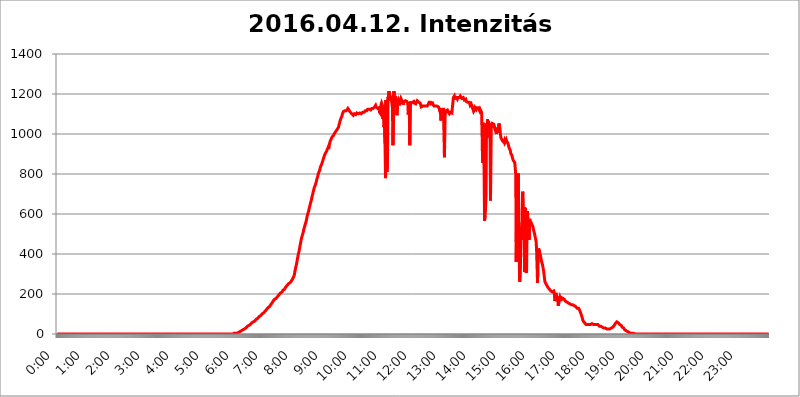
| Category | 2016.04.12. Intenzitás [W/m^2] |
|---|---|
| 0.0 | 0 |
| 0.0006944444444444445 | 0 |
| 0.001388888888888889 | 0 |
| 0.0020833333333333333 | 0 |
| 0.002777777777777778 | 0 |
| 0.003472222222222222 | 0 |
| 0.004166666666666667 | 0 |
| 0.004861111111111111 | 0 |
| 0.005555555555555556 | 0 |
| 0.0062499999999999995 | 0 |
| 0.006944444444444444 | 0 |
| 0.007638888888888889 | 0 |
| 0.008333333333333333 | 0 |
| 0.009027777777777779 | 0 |
| 0.009722222222222222 | 0 |
| 0.010416666666666666 | 0 |
| 0.011111111111111112 | 0 |
| 0.011805555555555555 | 0 |
| 0.012499999999999999 | 0 |
| 0.013194444444444444 | 0 |
| 0.013888888888888888 | 0 |
| 0.014583333333333332 | 0 |
| 0.015277777777777777 | 0 |
| 0.015972222222222224 | 0 |
| 0.016666666666666666 | 0 |
| 0.017361111111111112 | 0 |
| 0.018055555555555557 | 0 |
| 0.01875 | 0 |
| 0.019444444444444445 | 0 |
| 0.02013888888888889 | 0 |
| 0.020833333333333332 | 0 |
| 0.02152777777777778 | 0 |
| 0.022222222222222223 | 0 |
| 0.02291666666666667 | 0 |
| 0.02361111111111111 | 0 |
| 0.024305555555555556 | 0 |
| 0.024999999999999998 | 0 |
| 0.025694444444444447 | 0 |
| 0.02638888888888889 | 0 |
| 0.027083333333333334 | 0 |
| 0.027777777777777776 | 0 |
| 0.02847222222222222 | 0 |
| 0.029166666666666664 | 0 |
| 0.029861111111111113 | 0 |
| 0.030555555555555555 | 0 |
| 0.03125 | 0 |
| 0.03194444444444445 | 0 |
| 0.03263888888888889 | 0 |
| 0.03333333333333333 | 0 |
| 0.034027777777777775 | 0 |
| 0.034722222222222224 | 0 |
| 0.035416666666666666 | 0 |
| 0.036111111111111115 | 0 |
| 0.03680555555555556 | 0 |
| 0.0375 | 0 |
| 0.03819444444444444 | 0 |
| 0.03888888888888889 | 0 |
| 0.03958333333333333 | 0 |
| 0.04027777777777778 | 0 |
| 0.04097222222222222 | 0 |
| 0.041666666666666664 | 0 |
| 0.042361111111111106 | 0 |
| 0.04305555555555556 | 0 |
| 0.043750000000000004 | 0 |
| 0.044444444444444446 | 0 |
| 0.04513888888888889 | 0 |
| 0.04583333333333334 | 0 |
| 0.04652777777777778 | 0 |
| 0.04722222222222222 | 0 |
| 0.04791666666666666 | 0 |
| 0.04861111111111111 | 0 |
| 0.049305555555555554 | 0 |
| 0.049999999999999996 | 0 |
| 0.05069444444444445 | 0 |
| 0.051388888888888894 | 0 |
| 0.052083333333333336 | 0 |
| 0.05277777777777778 | 0 |
| 0.05347222222222222 | 0 |
| 0.05416666666666667 | 0 |
| 0.05486111111111111 | 0 |
| 0.05555555555555555 | 0 |
| 0.05625 | 0 |
| 0.05694444444444444 | 0 |
| 0.057638888888888885 | 0 |
| 0.05833333333333333 | 0 |
| 0.05902777777777778 | 0 |
| 0.059722222222222225 | 0 |
| 0.06041666666666667 | 0 |
| 0.061111111111111116 | 0 |
| 0.06180555555555556 | 0 |
| 0.0625 | 0 |
| 0.06319444444444444 | 0 |
| 0.06388888888888888 | 0 |
| 0.06458333333333334 | 0 |
| 0.06527777777777778 | 0 |
| 0.06597222222222222 | 0 |
| 0.06666666666666667 | 0 |
| 0.06736111111111111 | 0 |
| 0.06805555555555555 | 0 |
| 0.06874999999999999 | 0 |
| 0.06944444444444443 | 0 |
| 0.07013888888888889 | 0 |
| 0.07083333333333333 | 0 |
| 0.07152777777777779 | 0 |
| 0.07222222222222223 | 0 |
| 0.07291666666666667 | 0 |
| 0.07361111111111111 | 0 |
| 0.07430555555555556 | 0 |
| 0.075 | 0 |
| 0.07569444444444444 | 0 |
| 0.0763888888888889 | 0 |
| 0.07708333333333334 | 0 |
| 0.07777777777777778 | 0 |
| 0.07847222222222222 | 0 |
| 0.07916666666666666 | 0 |
| 0.0798611111111111 | 0 |
| 0.08055555555555556 | 0 |
| 0.08125 | 0 |
| 0.08194444444444444 | 0 |
| 0.08263888888888889 | 0 |
| 0.08333333333333333 | 0 |
| 0.08402777777777777 | 0 |
| 0.08472222222222221 | 0 |
| 0.08541666666666665 | 0 |
| 0.08611111111111112 | 0 |
| 0.08680555555555557 | 0 |
| 0.08750000000000001 | 0 |
| 0.08819444444444445 | 0 |
| 0.08888888888888889 | 0 |
| 0.08958333333333333 | 0 |
| 0.09027777777777778 | 0 |
| 0.09097222222222222 | 0 |
| 0.09166666666666667 | 0 |
| 0.09236111111111112 | 0 |
| 0.09305555555555556 | 0 |
| 0.09375 | 0 |
| 0.09444444444444444 | 0 |
| 0.09513888888888888 | 0 |
| 0.09583333333333333 | 0 |
| 0.09652777777777777 | 0 |
| 0.09722222222222222 | 0 |
| 0.09791666666666667 | 0 |
| 0.09861111111111111 | 0 |
| 0.09930555555555555 | 0 |
| 0.09999999999999999 | 0 |
| 0.10069444444444443 | 0 |
| 0.1013888888888889 | 0 |
| 0.10208333333333335 | 0 |
| 0.10277777777777779 | 0 |
| 0.10347222222222223 | 0 |
| 0.10416666666666667 | 0 |
| 0.10486111111111111 | 0 |
| 0.10555555555555556 | 0 |
| 0.10625 | 0 |
| 0.10694444444444444 | 0 |
| 0.1076388888888889 | 0 |
| 0.10833333333333334 | 0 |
| 0.10902777777777778 | 0 |
| 0.10972222222222222 | 0 |
| 0.1111111111111111 | 0 |
| 0.11180555555555556 | 0 |
| 0.11180555555555556 | 0 |
| 0.1125 | 0 |
| 0.11319444444444444 | 0 |
| 0.11388888888888889 | 0 |
| 0.11458333333333333 | 0 |
| 0.11527777777777777 | 0 |
| 0.11597222222222221 | 0 |
| 0.11666666666666665 | 0 |
| 0.1173611111111111 | 0 |
| 0.11805555555555557 | 0 |
| 0.11944444444444445 | 0 |
| 0.12013888888888889 | 0 |
| 0.12083333333333333 | 0 |
| 0.12152777777777778 | 0 |
| 0.12222222222222223 | 0 |
| 0.12291666666666667 | 0 |
| 0.12291666666666667 | 0 |
| 0.12361111111111112 | 0 |
| 0.12430555555555556 | 0 |
| 0.125 | 0 |
| 0.12569444444444444 | 0 |
| 0.12638888888888888 | 0 |
| 0.12708333333333333 | 0 |
| 0.16875 | 0 |
| 0.12847222222222224 | 0 |
| 0.12916666666666668 | 0 |
| 0.12986111111111112 | 0 |
| 0.13055555555555556 | 0 |
| 0.13125 | 0 |
| 0.13194444444444445 | 0 |
| 0.1326388888888889 | 0 |
| 0.13333333333333333 | 0 |
| 0.13402777777777777 | 0 |
| 0.13402777777777777 | 0 |
| 0.13472222222222222 | 0 |
| 0.13541666666666666 | 0 |
| 0.1361111111111111 | 0 |
| 0.13749999999999998 | 0 |
| 0.13819444444444443 | 0 |
| 0.1388888888888889 | 0 |
| 0.13958333333333334 | 0 |
| 0.14027777777777778 | 0 |
| 0.14097222222222222 | 0 |
| 0.14166666666666666 | 0 |
| 0.1423611111111111 | 0 |
| 0.14305555555555557 | 0 |
| 0.14375000000000002 | 0 |
| 0.14444444444444446 | 0 |
| 0.1451388888888889 | 0 |
| 0.1451388888888889 | 0 |
| 0.14652777777777778 | 0 |
| 0.14722222222222223 | 0 |
| 0.14791666666666667 | 0 |
| 0.1486111111111111 | 0 |
| 0.14930555555555555 | 0 |
| 0.15 | 0 |
| 0.15069444444444444 | 0 |
| 0.15138888888888888 | 0 |
| 0.15208333333333332 | 0 |
| 0.15277777777777776 | 0 |
| 0.15347222222222223 | 0 |
| 0.15416666666666667 | 0 |
| 0.15486111111111112 | 0 |
| 0.15555555555555556 | 0 |
| 0.15625 | 0 |
| 0.15694444444444444 | 0 |
| 0.15763888888888888 | 0 |
| 0.15833333333333333 | 0 |
| 0.15902777777777777 | 0 |
| 0.15972222222222224 | 0 |
| 0.16041666666666668 | 0 |
| 0.16111111111111112 | 0 |
| 0.16180555555555556 | 0 |
| 0.1625 | 0 |
| 0.16319444444444445 | 0 |
| 0.1638888888888889 | 0 |
| 0.16458333333333333 | 0 |
| 0.16527777777777777 | 0 |
| 0.16597222222222222 | 0 |
| 0.16666666666666666 | 0 |
| 0.1673611111111111 | 0 |
| 0.16805555555555554 | 0 |
| 0.16874999999999998 | 0 |
| 0.16944444444444443 | 0 |
| 0.17013888888888887 | 0 |
| 0.1708333333333333 | 0 |
| 0.17152777777777775 | 0 |
| 0.17222222222222225 | 0 |
| 0.1729166666666667 | 0 |
| 0.17361111111111113 | 0 |
| 0.17430555555555557 | 0 |
| 0.17500000000000002 | 0 |
| 0.17569444444444446 | 0 |
| 0.1763888888888889 | 0 |
| 0.17708333333333334 | 0 |
| 0.17777777777777778 | 0 |
| 0.17847222222222223 | 0 |
| 0.17916666666666667 | 0 |
| 0.1798611111111111 | 0 |
| 0.18055555555555555 | 0 |
| 0.18125 | 0 |
| 0.18194444444444444 | 0 |
| 0.1826388888888889 | 0 |
| 0.18333333333333335 | 0 |
| 0.1840277777777778 | 0 |
| 0.18472222222222223 | 0 |
| 0.18541666666666667 | 0 |
| 0.18611111111111112 | 0 |
| 0.18680555555555556 | 0 |
| 0.1875 | 0 |
| 0.18819444444444444 | 0 |
| 0.18888888888888888 | 0 |
| 0.18958333333333333 | 0 |
| 0.19027777777777777 | 0 |
| 0.1909722222222222 | 0 |
| 0.19166666666666665 | 0 |
| 0.19236111111111112 | 0 |
| 0.19305555555555554 | 0 |
| 0.19375 | 0 |
| 0.19444444444444445 | 0 |
| 0.1951388888888889 | 0 |
| 0.19583333333333333 | 0 |
| 0.19652777777777777 | 0 |
| 0.19722222222222222 | 0 |
| 0.19791666666666666 | 0 |
| 0.1986111111111111 | 0 |
| 0.19930555555555554 | 0 |
| 0.19999999999999998 | 0 |
| 0.20069444444444443 | 0 |
| 0.20138888888888887 | 0 |
| 0.2020833333333333 | 0 |
| 0.2027777777777778 | 0 |
| 0.2034722222222222 | 0 |
| 0.2041666666666667 | 0 |
| 0.20486111111111113 | 0 |
| 0.20555555555555557 | 0 |
| 0.20625000000000002 | 0 |
| 0.20694444444444446 | 0 |
| 0.2076388888888889 | 0 |
| 0.20833333333333334 | 0 |
| 0.20902777777777778 | 0 |
| 0.20972222222222223 | 0 |
| 0.21041666666666667 | 0 |
| 0.2111111111111111 | 0 |
| 0.21180555555555555 | 0 |
| 0.2125 | 0 |
| 0.21319444444444444 | 0 |
| 0.2138888888888889 | 0 |
| 0.21458333333333335 | 0 |
| 0.2152777777777778 | 0 |
| 0.21597222222222223 | 0 |
| 0.21666666666666667 | 0 |
| 0.21736111111111112 | 0 |
| 0.21805555555555556 | 0 |
| 0.21875 | 0 |
| 0.21944444444444444 | 0 |
| 0.22013888888888888 | 0 |
| 0.22083333333333333 | 0 |
| 0.22152777777777777 | 0 |
| 0.2222222222222222 | 0 |
| 0.22291666666666665 | 0 |
| 0.2236111111111111 | 0 |
| 0.22430555555555556 | 0 |
| 0.225 | 0 |
| 0.22569444444444445 | 0 |
| 0.2263888888888889 | 0 |
| 0.22708333333333333 | 0 |
| 0.22777777777777777 | 0 |
| 0.22847222222222222 | 0 |
| 0.22916666666666666 | 0 |
| 0.2298611111111111 | 0 |
| 0.23055555555555554 | 0 |
| 0.23124999999999998 | 0 |
| 0.23194444444444443 | 0 |
| 0.23263888888888887 | 0 |
| 0.2333333333333333 | 0 |
| 0.2340277777777778 | 0 |
| 0.2347222222222222 | 0 |
| 0.2354166666666667 | 0 |
| 0.23611111111111113 | 0 |
| 0.23680555555555557 | 0 |
| 0.23750000000000002 | 0 |
| 0.23819444444444446 | 0 |
| 0.2388888888888889 | 0 |
| 0.23958333333333334 | 0 |
| 0.24027777777777778 | 0 |
| 0.24097222222222223 | 0 |
| 0.24166666666666667 | 0 |
| 0.2423611111111111 | 0 |
| 0.24305555555555555 | 0 |
| 0.24375 | 0 |
| 0.24444444444444446 | 0 |
| 0.24513888888888888 | 0 |
| 0.24583333333333335 | 0 |
| 0.2465277777777778 | 0 |
| 0.24722222222222223 | 3.525 |
| 0.24791666666666667 | 3.525 |
| 0.24861111111111112 | 3.525 |
| 0.24930555555555556 | 3.525 |
| 0.25 | 3.525 |
| 0.25069444444444444 | 3.525 |
| 0.2513888888888889 | 3.525 |
| 0.2520833333333333 | 3.525 |
| 0.25277777777777777 | 7.887 |
| 0.2534722222222222 | 7.887 |
| 0.25416666666666665 | 7.887 |
| 0.2548611111111111 | 7.887 |
| 0.2555555555555556 | 12.257 |
| 0.25625000000000003 | 12.257 |
| 0.2569444444444445 | 12.257 |
| 0.2576388888888889 | 16.636 |
| 0.25833333333333336 | 16.636 |
| 0.2590277777777778 | 16.636 |
| 0.25972222222222224 | 21.024 |
| 0.2604166666666667 | 21.024 |
| 0.2611111111111111 | 21.024 |
| 0.26180555555555557 | 25.419 |
| 0.2625 | 25.419 |
| 0.26319444444444445 | 29.823 |
| 0.2638888888888889 | 29.823 |
| 0.26458333333333334 | 29.823 |
| 0.2652777777777778 | 34.234 |
| 0.2659722222222222 | 34.234 |
| 0.26666666666666666 | 38.653 |
| 0.2673611111111111 | 38.653 |
| 0.26805555555555555 | 43.079 |
| 0.26875 | 43.079 |
| 0.26944444444444443 | 43.079 |
| 0.2701388888888889 | 47.511 |
| 0.2708333333333333 | 47.511 |
| 0.27152777777777776 | 51.951 |
| 0.2722222222222222 | 51.951 |
| 0.27291666666666664 | 56.398 |
| 0.2736111111111111 | 56.398 |
| 0.2743055555555555 | 60.85 |
| 0.27499999999999997 | 60.85 |
| 0.27569444444444446 | 65.31 |
| 0.27638888888888885 | 65.31 |
| 0.27708333333333335 | 65.31 |
| 0.2777777777777778 | 69.775 |
| 0.27847222222222223 | 69.775 |
| 0.2791666666666667 | 74.246 |
| 0.2798611111111111 | 74.246 |
| 0.28055555555555556 | 78.722 |
| 0.28125 | 78.722 |
| 0.28194444444444444 | 83.205 |
| 0.2826388888888889 | 83.205 |
| 0.2833333333333333 | 87.692 |
| 0.28402777777777777 | 87.692 |
| 0.2847222222222222 | 87.692 |
| 0.28541666666666665 | 92.184 |
| 0.28611111111111115 | 92.184 |
| 0.28680555555555554 | 96.682 |
| 0.28750000000000003 | 101.184 |
| 0.2881944444444445 | 101.184 |
| 0.2888888888888889 | 105.69 |
| 0.28958333333333336 | 105.69 |
| 0.2902777777777778 | 110.201 |
| 0.29097222222222224 | 110.201 |
| 0.2916666666666667 | 114.716 |
| 0.2923611111111111 | 119.235 |
| 0.29305555555555557 | 119.235 |
| 0.29375 | 123.758 |
| 0.29444444444444445 | 123.758 |
| 0.2951388888888889 | 128.284 |
| 0.29583333333333334 | 132.814 |
| 0.2965277777777778 | 132.814 |
| 0.2972222222222222 | 137.347 |
| 0.29791666666666666 | 137.347 |
| 0.2986111111111111 | 141.884 |
| 0.29930555555555555 | 146.423 |
| 0.3 | 146.423 |
| 0.30069444444444443 | 150.964 |
| 0.3013888888888889 | 155.509 |
| 0.3020833333333333 | 160.056 |
| 0.30277777777777776 | 164.605 |
| 0.3034722222222222 | 164.605 |
| 0.30416666666666664 | 169.156 |
| 0.3048611111111111 | 173.709 |
| 0.3055555555555555 | 173.709 |
| 0.30624999999999997 | 178.264 |
| 0.3069444444444444 | 178.264 |
| 0.3076388888888889 | 182.82 |
| 0.30833333333333335 | 182.82 |
| 0.3090277777777778 | 187.378 |
| 0.30972222222222223 | 191.937 |
| 0.3104166666666667 | 191.937 |
| 0.3111111111111111 | 196.497 |
| 0.31180555555555556 | 196.497 |
| 0.3125 | 201.058 |
| 0.31319444444444444 | 205.62 |
| 0.3138888888888889 | 210.182 |
| 0.3145833333333333 | 210.182 |
| 0.31527777777777777 | 210.182 |
| 0.3159722222222222 | 214.746 |
| 0.31666666666666665 | 219.309 |
| 0.31736111111111115 | 219.309 |
| 0.31805555555555554 | 223.873 |
| 0.31875000000000003 | 223.873 |
| 0.3194444444444445 | 228.436 |
| 0.3201388888888889 | 233 |
| 0.32083333333333336 | 233 |
| 0.3215277777777778 | 237.564 |
| 0.32222222222222224 | 242.127 |
| 0.3229166666666667 | 242.127 |
| 0.3236111111111111 | 246.689 |
| 0.32430555555555557 | 251.251 |
| 0.325 | 251.251 |
| 0.32569444444444445 | 255.813 |
| 0.3263888888888889 | 255.813 |
| 0.32708333333333334 | 260.373 |
| 0.3277777777777778 | 260.373 |
| 0.3284722222222222 | 264.932 |
| 0.32916666666666666 | 269.49 |
| 0.3298611111111111 | 274.047 |
| 0.33055555555555555 | 278.603 |
| 0.33125 | 283.156 |
| 0.33194444444444443 | 287.709 |
| 0.3326388888888889 | 296.808 |
| 0.3333333333333333 | 314.98 |
| 0.3340277777777778 | 324.052 |
| 0.3347222222222222 | 337.639 |
| 0.3354166666666667 | 346.682 |
| 0.3361111111111111 | 360.221 |
| 0.3368055555555556 | 373.729 |
| 0.33749999999999997 | 387.202 |
| 0.33819444444444446 | 400.638 |
| 0.33888888888888885 | 409.574 |
| 0.33958333333333335 | 422.943 |
| 0.34027777777777773 | 436.27 |
| 0.34097222222222223 | 449.551 |
| 0.3416666666666666 | 462.786 |
| 0.3423611111111111 | 475.972 |
| 0.3430555555555555 | 484.735 |
| 0.34375 | 493.475 |
| 0.3444444444444445 | 502.192 |
| 0.3451388888888889 | 510.885 |
| 0.3458333333333334 | 523.88 |
| 0.34652777777777777 | 528.2 |
| 0.34722222222222227 | 541.121 |
| 0.34791666666666665 | 545.416 |
| 0.34861111111111115 | 558.261 |
| 0.34930555555555554 | 566.793 |
| 0.35000000000000003 | 579.542 |
| 0.3506944444444444 | 592.233 |
| 0.3513888888888889 | 600.661 |
| 0.3520833333333333 | 609.062 |
| 0.3527777777777778 | 617.436 |
| 0.3534722222222222 | 629.948 |
| 0.3541666666666667 | 638.256 |
| 0.3548611111111111 | 650.667 |
| 0.35555555555555557 | 658.909 |
| 0.35625 | 667.123 |
| 0.35694444444444445 | 679.395 |
| 0.3576388888888889 | 691.608 |
| 0.35833333333333334 | 699.717 |
| 0.3590277777777778 | 711.832 |
| 0.3597222222222222 | 719.877 |
| 0.36041666666666666 | 731.896 |
| 0.3611111111111111 | 735.89 |
| 0.36180555555555555 | 743.859 |
| 0.3625 | 751.803 |
| 0.36319444444444443 | 759.723 |
| 0.3638888888888889 | 771.559 |
| 0.3645833333333333 | 779.42 |
| 0.3652777777777778 | 787.258 |
| 0.3659722222222222 | 798.974 |
| 0.3666666666666667 | 806.757 |
| 0.3673611111111111 | 810.641 |
| 0.3680555555555556 | 818.392 |
| 0.36874999999999997 | 829.981 |
| 0.36944444444444446 | 837.682 |
| 0.37013888888888885 | 841.526 |
| 0.37083333333333335 | 849.199 |
| 0.37152777777777773 | 856.855 |
| 0.37222222222222223 | 864.493 |
| 0.3729166666666666 | 872.114 |
| 0.3736111111111111 | 879.719 |
| 0.3743055555555555 | 887.309 |
| 0.375 | 894.885 |
| 0.3756944444444445 | 898.668 |
| 0.3763888888888889 | 906.223 |
| 0.3770833333333334 | 909.996 |
| 0.37777777777777777 | 913.766 |
| 0.37847222222222227 | 921.298 |
| 0.37916666666666665 | 921.298 |
| 0.37986111111111115 | 932.576 |
| 0.38055555555555554 | 925.06 |
| 0.38125000000000003 | 940.082 |
| 0.3819444444444444 | 951.327 |
| 0.3826388888888889 | 962.555 |
| 0.3833333333333333 | 966.295 |
| 0.3840277777777778 | 973.772 |
| 0.3847222222222222 | 977.508 |
| 0.3854166666666667 | 984.98 |
| 0.3861111111111111 | 981.244 |
| 0.38680555555555557 | 988.714 |
| 0.3875 | 992.448 |
| 0.38819444444444445 | 996.182 |
| 0.3888888888888889 | 1003.65 |
| 0.38958333333333334 | 1007.383 |
| 0.3902777777777778 | 1011.118 |
| 0.3909722222222222 | 1014.852 |
| 0.39166666666666666 | 1014.852 |
| 0.3923611111111111 | 1022.323 |
| 0.39305555555555555 | 1022.323 |
| 0.39375 | 1026.06 |
| 0.39444444444444443 | 1033.537 |
| 0.3951388888888889 | 1044.762 |
| 0.3958333333333333 | 1052.255 |
| 0.3965277777777778 | 1063.51 |
| 0.3972222222222222 | 1067.267 |
| 0.3979166666666667 | 1078.555 |
| 0.3986111111111111 | 1078.555 |
| 0.3993055555555556 | 1089.873 |
| 0.39999999999999997 | 1101.226 |
| 0.40069444444444446 | 1105.019 |
| 0.40138888888888885 | 1112.618 |
| 0.40208333333333335 | 1116.426 |
| 0.40277777777777773 | 1116.426 |
| 0.40347222222222223 | 1116.426 |
| 0.4041666666666666 | 1116.426 |
| 0.4048611111111111 | 1116.426 |
| 0.4055555555555555 | 1116.426 |
| 0.40625 | 1120.238 |
| 0.4069444444444445 | 1120.238 |
| 0.4076388888888889 | 1127.879 |
| 0.4083333333333334 | 1127.879 |
| 0.40902777777777777 | 1124.056 |
| 0.40972222222222227 | 1116.426 |
| 0.41041666666666665 | 1112.618 |
| 0.41111111111111115 | 1108.816 |
| 0.41180555555555554 | 1108.816 |
| 0.41250000000000003 | 1108.816 |
| 0.4131944444444444 | 1101.226 |
| 0.4138888888888889 | 1097.437 |
| 0.4145833333333333 | 1101.226 |
| 0.4152777777777778 | 1093.653 |
| 0.4159722222222222 | 1097.437 |
| 0.4166666666666667 | 1101.226 |
| 0.4173611111111111 | 1101.226 |
| 0.41805555555555557 | 1097.437 |
| 0.41875 | 1097.437 |
| 0.41944444444444445 | 1101.226 |
| 0.4201388888888889 | 1105.019 |
| 0.42083333333333334 | 1101.226 |
| 0.4215277777777778 | 1105.019 |
| 0.4222222222222222 | 1101.226 |
| 0.42291666666666666 | 1101.226 |
| 0.4236111111111111 | 1101.226 |
| 0.42430555555555555 | 1105.019 |
| 0.425 | 1101.226 |
| 0.42569444444444443 | 1101.226 |
| 0.4263888888888889 | 1101.226 |
| 0.4270833333333333 | 1105.019 |
| 0.4277777777777778 | 1101.226 |
| 0.4284722222222222 | 1108.816 |
| 0.4291666666666667 | 1108.816 |
| 0.4298611111111111 | 1108.816 |
| 0.4305555555555556 | 1108.816 |
| 0.43124999999999997 | 1112.618 |
| 0.43194444444444446 | 1116.426 |
| 0.43263888888888885 | 1112.618 |
| 0.43333333333333335 | 1116.426 |
| 0.43402777777777773 | 1116.426 |
| 0.43472222222222223 | 1120.238 |
| 0.4354166666666666 | 1124.056 |
| 0.4361111111111111 | 1120.238 |
| 0.4368055555555555 | 1120.238 |
| 0.4375 | 1124.056 |
| 0.4381944444444445 | 1124.056 |
| 0.4388888888888889 | 1120.238 |
| 0.4395833333333334 | 1120.238 |
| 0.44027777777777777 | 1124.056 |
| 0.44097222222222227 | 1127.879 |
| 0.44166666666666665 | 1127.879 |
| 0.44236111111111115 | 1124.056 |
| 0.44305555555555554 | 1127.879 |
| 0.44375000000000003 | 1127.879 |
| 0.4444444444444444 | 1124.056 |
| 0.4451388888888889 | 1135.543 |
| 0.4458333333333333 | 1139.384 |
| 0.4465277777777778 | 1143.232 |
| 0.4472222222222222 | 1135.543 |
| 0.4479166666666667 | 1135.543 |
| 0.4486111111111111 | 1135.543 |
| 0.44930555555555557 | 1127.879 |
| 0.45 | 1124.056 |
| 0.45069444444444445 | 1124.056 |
| 0.4513888888888889 | 1131.708 |
| 0.45208333333333334 | 1108.816 |
| 0.4527777777777778 | 1105.019 |
| 0.4534722222222222 | 1101.226 |
| 0.45416666666666666 | 1147.086 |
| 0.4548611111111111 | 1154.814 |
| 0.45555555555555555 | 1150.946 |
| 0.45625 | 1139.384 |
| 0.45694444444444443 | 1074.789 |
| 0.4576388888888889 | 1143.232 |
| 0.4583333333333333 | 1033.537 |
| 0.4590277777777778 | 1048.508 |
| 0.4597222222222222 | 951.327 |
| 0.4604166666666667 | 779.42 |
| 0.4611111111111111 | 1170.358 |
| 0.4618055555555556 | 921.298 |
| 0.46249999999999997 | 810.641 |
| 0.46319444444444446 | 872.114 |
| 0.46388888888888885 | 1186.03 |
| 0.46458333333333335 | 1166.46 |
| 0.46527777777777773 | 1213.804 |
| 0.46597222222222223 | 1189.969 |
| 0.4666666666666666 | 1186.03 |
| 0.4673611111111111 | 1193.918 |
| 0.4680555555555555 | 1186.03 |
| 0.46875 | 1189.969 |
| 0.4694444444444445 | 1150.946 |
| 0.4701388888888889 | 1131.708 |
| 0.4708333333333334 | 943.832 |
| 0.47152777777777777 | 947.58 |
| 0.47222222222222227 | 1213.804 |
| 0.47291666666666665 | 1150.946 |
| 0.47361111111111115 | 1162.571 |
| 0.47430555555555554 | 1189.969 |
| 0.47500000000000003 | 1174.263 |
| 0.4756944444444444 | 1158.689 |
| 0.4763888888888889 | 1093.653 |
| 0.4770833333333333 | 1147.086 |
| 0.4777777777777778 | 1162.571 |
| 0.4784722222222222 | 1170.358 |
| 0.4791666666666667 | 1162.571 |
| 0.4798611111111111 | 1143.232 |
| 0.48055555555555557 | 1154.814 |
| 0.48125 | 1170.358 |
| 0.48194444444444445 | 1178.177 |
| 0.4826388888888889 | 1174.263 |
| 0.48333333333333334 | 1166.46 |
| 0.4840277777777778 | 1150.946 |
| 0.4847222222222222 | 1162.571 |
| 0.48541666666666666 | 1147.086 |
| 0.4861111111111111 | 1162.571 |
| 0.48680555555555555 | 1158.689 |
| 0.4875 | 1162.571 |
| 0.48819444444444443 | 1166.46 |
| 0.4888888888888889 | 1166.46 |
| 0.4895833333333333 | 1170.358 |
| 0.4902777777777778 | 1162.571 |
| 0.4909722222222222 | 1162.571 |
| 0.4916666666666667 | 1150.946 |
| 0.4923611111111111 | 1097.437 |
| 0.4930555555555556 | 1158.689 |
| 0.49374999999999997 | 1135.543 |
| 0.49444444444444446 | 943.832 |
| 0.49513888888888885 | 1162.571 |
| 0.49583333333333335 | 1150.946 |
| 0.49652777777777773 | 1150.946 |
| 0.49722222222222223 | 1150.946 |
| 0.4979166666666666 | 1158.689 |
| 0.4986111111111111 | 1154.814 |
| 0.4993055555555555 | 1158.689 |
| 0.5 | 1162.571 |
| 0.5006944444444444 | 1154.814 |
| 0.5013888888888889 | 1150.946 |
| 0.5020833333333333 | 1154.814 |
| 0.5027777777777778 | 1150.946 |
| 0.5034722222222222 | 1150.946 |
| 0.5041666666666667 | 1147.086 |
| 0.5048611111111111 | 1166.46 |
| 0.5055555555555555 | 1162.571 |
| 0.50625 | 1162.571 |
| 0.5069444444444444 | 1158.689 |
| 0.5076388888888889 | 1154.814 |
| 0.5083333333333333 | 1154.814 |
| 0.5090277777777777 | 1154.814 |
| 0.5097222222222222 | 1147.086 |
| 0.5104166666666666 | 1135.543 |
| 0.5111111111111112 | 1131.708 |
| 0.5118055555555555 | 1135.543 |
| 0.5125000000000001 | 1139.384 |
| 0.5131944444444444 | 1143.232 |
| 0.513888888888889 | 1135.543 |
| 0.5145833333333333 | 1139.384 |
| 0.5152777777777778 | 1139.384 |
| 0.5159722222222222 | 1143.232 |
| 0.5166666666666667 | 1139.384 |
| 0.517361111111111 | 1139.384 |
| 0.5180555555555556 | 1139.384 |
| 0.5187499999999999 | 1139.384 |
| 0.5194444444444445 | 1143.232 |
| 0.5201388888888888 | 1147.086 |
| 0.5208333333333334 | 1147.086 |
| 0.5215277777777778 | 1158.689 |
| 0.5222222222222223 | 1158.689 |
| 0.5229166666666667 | 1162.571 |
| 0.5236111111111111 | 1158.689 |
| 0.5243055555555556 | 1150.946 |
| 0.525 | 1154.814 |
| 0.5256944444444445 | 1154.814 |
| 0.5263888888888889 | 1154.814 |
| 0.5270833333333333 | 1147.086 |
| 0.5277777777777778 | 1147.086 |
| 0.5284722222222222 | 1139.384 |
| 0.5291666666666667 | 1143.232 |
| 0.5298611111111111 | 1139.384 |
| 0.5305555555555556 | 1139.384 |
| 0.53125 | 1139.384 |
| 0.5319444444444444 | 1139.384 |
| 0.5326388888888889 | 1139.384 |
| 0.5333333333333333 | 1139.384 |
| 0.5340277777777778 | 1139.384 |
| 0.5347222222222222 | 1135.543 |
| 0.5354166666666667 | 1131.708 |
| 0.5361111111111111 | 1120.238 |
| 0.5368055555555555 | 1127.879 |
| 0.5375 | 1108.816 |
| 0.5381944444444444 | 1067.267 |
| 0.5388888888888889 | 1116.426 |
| 0.5395833333333333 | 1124.056 |
| 0.5402777777777777 | 1120.238 |
| 0.5409722222222222 | 1124.056 |
| 0.5416666666666666 | 1124.056 |
| 0.5423611111111112 | 1120.238 |
| 0.5430555555555555 | 883.516 |
| 0.5437500000000001 | 1120.238 |
| 0.5444444444444444 | 1108.816 |
| 0.545138888888889 | 1116.426 |
| 0.5458333333333333 | 1112.618 |
| 0.5465277777777778 | 1120.238 |
| 0.5472222222222222 | 1120.238 |
| 0.5479166666666667 | 1116.426 |
| 0.548611111111111 | 1108.816 |
| 0.5493055555555556 | 1108.816 |
| 0.5499999999999999 | 1101.226 |
| 0.5506944444444445 | 1101.226 |
| 0.5513888888888888 | 1108.816 |
| 0.5520833333333334 | 1105.019 |
| 0.5527777777777778 | 1105.019 |
| 0.5534722222222223 | 1105.019 |
| 0.5541666666666667 | 1105.019 |
| 0.5548611111111111 | 1101.226 |
| 0.5555555555555556 | 1182.099 |
| 0.55625 | 1182.099 |
| 0.5569444444444445 | 1189.969 |
| 0.5576388888888889 | 1178.177 |
| 0.5583333333333333 | 1178.177 |
| 0.5590277777777778 | 1182.099 |
| 0.5597222222222222 | 1182.099 |
| 0.5604166666666667 | 1178.177 |
| 0.5611111111111111 | 1174.263 |
| 0.5618055555555556 | 1182.099 |
| 0.5625 | 1186.03 |
| 0.5631944444444444 | 1186.03 |
| 0.5638888888888889 | 1182.099 |
| 0.5645833333333333 | 1186.03 |
| 0.5652777777777778 | 1189.969 |
| 0.5659722222222222 | 1189.969 |
| 0.5666666666666667 | 1189.969 |
| 0.5673611111111111 | 1178.177 |
| 0.5680555555555555 | 1174.263 |
| 0.56875 | 1182.099 |
| 0.5694444444444444 | 1182.099 |
| 0.5701388888888889 | 1182.099 |
| 0.5708333333333333 | 1170.358 |
| 0.5715277777777777 | 1174.263 |
| 0.5722222222222222 | 1170.358 |
| 0.5729166666666666 | 1174.263 |
| 0.5736111111111112 | 1162.571 |
| 0.5743055555555555 | 1166.46 |
| 0.5750000000000001 | 1162.571 |
| 0.5756944444444444 | 1158.689 |
| 0.576388888888889 | 1162.571 |
| 0.5770833333333333 | 1162.571 |
| 0.5777777777777778 | 1158.689 |
| 0.5784722222222222 | 1154.814 |
| 0.5791666666666667 | 1143.232 |
| 0.579861111111111 | 1143.232 |
| 0.5805555555555556 | 1150.946 |
| 0.5812499999999999 | 1147.086 |
| 0.5819444444444445 | 1139.384 |
| 0.5826388888888888 | 1127.879 |
| 0.5833333333333334 | 1124.056 |
| 0.5840277777777778 | 1112.618 |
| 0.5847222222222223 | 1108.816 |
| 0.5854166666666667 | 1120.238 |
| 0.5861111111111111 | 1131.708 |
| 0.5868055555555556 | 1131.708 |
| 0.5875 | 1124.056 |
| 0.5881944444444445 | 1131.708 |
| 0.5888888888888889 | 1127.879 |
| 0.5895833333333333 | 1127.879 |
| 0.5902777777777778 | 1131.708 |
| 0.5909722222222222 | 1131.708 |
| 0.5916666666666667 | 1131.708 |
| 0.5923611111111111 | 1116.426 |
| 0.5930555555555556 | 1124.056 |
| 0.59375 | 1120.238 |
| 0.5944444444444444 | 1127.879 |
| 0.5951388888888889 | 1108.816 |
| 0.5958333333333333 | 1003.65 |
| 0.5965277777777778 | 856.855 |
| 0.5972222222222222 | 1056.004 |
| 0.5979166666666667 | 883.516 |
| 0.5986111111111111 | 837.682 |
| 0.5993055555555555 | 566.793 |
| 0.6 | 592.233 |
| 0.6006944444444444 | 625.784 |
| 0.6013888888888889 | 695.666 |
| 0.6020833333333333 | 1052.255 |
| 0.6027777777777777 | 981.244 |
| 0.6034722222222222 | 1074.789 |
| 0.6041666666666666 | 1048.508 |
| 0.6048611111111112 | 1063.51 |
| 0.6055555555555555 | 1067.267 |
| 0.6062500000000001 | 1029.798 |
| 0.6069444444444444 | 1022.323 |
| 0.607638888888889 | 667.123 |
| 0.6083333333333333 | 1052.255 |
| 0.6090277777777778 | 1052.255 |
| 0.6097222222222222 | 1029.798 |
| 0.6104166666666667 | 1052.255 |
| 0.611111111111111 | 1048.508 |
| 0.6118055555555556 | 1052.255 |
| 0.6124999999999999 | 1048.508 |
| 0.6131944444444445 | 1037.277 |
| 0.6138888888888888 | 1022.323 |
| 0.6145833333333334 | 1018.587 |
| 0.6152777777777778 | 1011.118 |
| 0.6159722222222223 | 999.916 |
| 0.6166666666666667 | 1018.587 |
| 0.6173611111111111 | 1026.06 |
| 0.6180555555555556 | 1033.537 |
| 0.61875 | 1007.383 |
| 0.6194444444444445 | 1052.255 |
| 0.6201388888888889 | 1041.019 |
| 0.6208333333333333 | 1029.798 |
| 0.6215277777777778 | 999.916 |
| 0.6222222222222222 | 981.244 |
| 0.6229166666666667 | 977.508 |
| 0.6236111111111111 | 984.98 |
| 0.6243055555555556 | 966.295 |
| 0.625 | 970.034 |
| 0.6256944444444444 | 970.034 |
| 0.6263888888888889 | 958.814 |
| 0.6270833333333333 | 966.295 |
| 0.6277777777777778 | 955.071 |
| 0.6284722222222222 | 955.071 |
| 0.6291666666666667 | 962.555 |
| 0.6298611111111111 | 970.034 |
| 0.6305555555555555 | 962.555 |
| 0.63125 | 958.814 |
| 0.6319444444444444 | 955.071 |
| 0.6326388888888889 | 951.327 |
| 0.6333333333333333 | 936.33 |
| 0.6340277777777777 | 928.819 |
| 0.6347222222222222 | 925.06 |
| 0.6354166666666666 | 917.534 |
| 0.6361111111111112 | 902.447 |
| 0.6368055555555555 | 898.668 |
| 0.6375000000000001 | 894.885 |
| 0.6381944444444444 | 883.516 |
| 0.638888888888889 | 879.719 |
| 0.6395833333333333 | 868.305 |
| 0.6402777777777778 | 864.493 |
| 0.6409722222222222 | 868.305 |
| 0.6416666666666667 | 856.855 |
| 0.642361111111111 | 853.029 |
| 0.6430555555555556 | 798.974 |
| 0.6437499999999999 | 360.221 |
| 0.6444444444444445 | 683.473 |
| 0.6451388888888888 | 747.834 |
| 0.6458333333333334 | 763.674 |
| 0.6465277777777778 | 802.868 |
| 0.6472222222222223 | 613.252 |
| 0.6479166666666667 | 378.224 |
| 0.6486111111111111 | 260.373 |
| 0.6493055555555556 | 255.813 |
| 0.65 | 396.164 |
| 0.6506944444444445 | 532.513 |
| 0.6513888888888889 | 523.88 |
| 0.6520833333333333 | 562.53 |
| 0.6527777777777778 | 711.832 |
| 0.6534722222222222 | 625.784 |
| 0.6541666666666667 | 471.582 |
| 0.6548611111111111 | 634.105 |
| 0.6555555555555556 | 310.44 |
| 0.65625 | 629.948 |
| 0.6569444444444444 | 621.613 |
| 0.6576388888888889 | 305.898 |
| 0.6583333333333333 | 319.517 |
| 0.6590277777777778 | 613.252 |
| 0.6597222222222222 | 604.864 |
| 0.6604166666666667 | 600.661 |
| 0.6611111111111111 | 528.2 |
| 0.6618055555555555 | 471.582 |
| 0.6625 | 575.299 |
| 0.6631944444444444 | 566.793 |
| 0.6638888888888889 | 562.53 |
| 0.6645833333333333 | 558.261 |
| 0.6652777777777777 | 549.704 |
| 0.6659722222222222 | 545.416 |
| 0.6666666666666666 | 541.121 |
| 0.6673611111111111 | 532.513 |
| 0.6680555555555556 | 519.555 |
| 0.6687500000000001 | 510.885 |
| 0.6694444444444444 | 506.542 |
| 0.6701388888888888 | 489.108 |
| 0.6708333333333334 | 475.972 |
| 0.6715277777777778 | 467.187 |
| 0.6722222222222222 | 427.39 |
| 0.6729166666666666 | 342.162 |
| 0.6736111111111112 | 255.813 |
| 0.6743055555555556 | 400.638 |
| 0.6749999999999999 | 427.39 |
| 0.6756944444444444 | 427.39 |
| 0.6763888888888889 | 414.035 |
| 0.6770833333333334 | 400.638 |
| 0.6777777777777777 | 391.685 |
| 0.6784722222222223 | 378.224 |
| 0.6791666666666667 | 364.728 |
| 0.6798611111111111 | 355.712 |
| 0.6805555555555555 | 346.682 |
| 0.68125 | 333.113 |
| 0.6819444444444445 | 319.517 |
| 0.6826388888888889 | 301.354 |
| 0.6833333333333332 | 278.603 |
| 0.6840277777777778 | 260.373 |
| 0.6847222222222222 | 255.813 |
| 0.6854166666666667 | 251.251 |
| 0.686111111111111 | 246.689 |
| 0.6868055555555556 | 242.127 |
| 0.6875 | 237.564 |
| 0.6881944444444444 | 233 |
| 0.688888888888889 | 233 |
| 0.6895833333333333 | 228.436 |
| 0.6902777777777778 | 223.873 |
| 0.6909722222222222 | 219.309 |
| 0.6916666666666668 | 219.309 |
| 0.6923611111111111 | 214.746 |
| 0.6930555555555555 | 210.182 |
| 0.69375 | 210.182 |
| 0.6944444444444445 | 210.182 |
| 0.6951388888888889 | 214.746 |
| 0.6958333333333333 | 214.746 |
| 0.6965277777777777 | 214.746 |
| 0.6972222222222223 | 201.058 |
| 0.6979166666666666 | 164.605 |
| 0.6986111111111111 | 173.709 |
| 0.6993055555555556 | 205.62 |
| 0.7000000000000001 | 205.62 |
| 0.7006944444444444 | 201.058 |
| 0.7013888888888888 | 173.709 |
| 0.7020833333333334 | 187.378 |
| 0.7027777777777778 | 141.884 |
| 0.7034722222222222 | 137.347 |
| 0.7041666666666666 | 173.709 |
| 0.7048611111111112 | 182.82 |
| 0.7055555555555556 | 187.378 |
| 0.7062499999999999 | 164.605 |
| 0.7069444444444444 | 182.82 |
| 0.7076388888888889 | 182.82 |
| 0.7083333333333334 | 182.82 |
| 0.7090277777777777 | 178.264 |
| 0.7097222222222223 | 173.709 |
| 0.7104166666666667 | 173.709 |
| 0.7111111111111111 | 173.709 |
| 0.7118055555555555 | 173.709 |
| 0.7125 | 164.605 |
| 0.7131944444444445 | 160.056 |
| 0.7138888888888889 | 160.056 |
| 0.7145833333333332 | 160.056 |
| 0.7152777777777778 | 155.509 |
| 0.7159722222222222 | 155.509 |
| 0.7166666666666667 | 155.509 |
| 0.717361111111111 | 155.509 |
| 0.7180555555555556 | 150.964 |
| 0.71875 | 150.964 |
| 0.7194444444444444 | 150.964 |
| 0.720138888888889 | 150.964 |
| 0.7208333333333333 | 146.423 |
| 0.7215277777777778 | 146.423 |
| 0.7222222222222222 | 146.423 |
| 0.7229166666666668 | 146.423 |
| 0.7236111111111111 | 146.423 |
| 0.7243055555555555 | 141.884 |
| 0.725 | 141.884 |
| 0.7256944444444445 | 137.347 |
| 0.7263888888888889 | 137.347 |
| 0.7270833333333333 | 137.347 |
| 0.7277777777777777 | 132.814 |
| 0.7284722222222223 | 132.814 |
| 0.7291666666666666 | 128.284 |
| 0.7298611111111111 | 128.284 |
| 0.7305555555555556 | 128.284 |
| 0.7312500000000001 | 128.284 |
| 0.7319444444444444 | 123.758 |
| 0.7326388888888888 | 119.235 |
| 0.7333333333333334 | 114.716 |
| 0.7340277777777778 | 105.69 |
| 0.7347222222222222 | 101.184 |
| 0.7354166666666666 | 92.184 |
| 0.7361111111111112 | 83.205 |
| 0.7368055555555556 | 74.246 |
| 0.7374999999999999 | 65.31 |
| 0.7381944444444444 | 60.85 |
| 0.7388888888888889 | 60.85 |
| 0.7395833333333334 | 56.398 |
| 0.7402777777777777 | 51.951 |
| 0.7409722222222223 | 51.951 |
| 0.7416666666666667 | 47.511 |
| 0.7423611111111111 | 47.511 |
| 0.7430555555555555 | 47.511 |
| 0.74375 | 47.511 |
| 0.7444444444444445 | 43.079 |
| 0.7451388888888889 | 43.079 |
| 0.7458333333333332 | 47.511 |
| 0.7465277777777778 | 47.511 |
| 0.7472222222222222 | 47.511 |
| 0.7479166666666667 | 47.511 |
| 0.748611111111111 | 51.951 |
| 0.7493055555555556 | 51.951 |
| 0.75 | 51.951 |
| 0.7506944444444444 | 51.951 |
| 0.751388888888889 | 47.511 |
| 0.7520833333333333 | 47.511 |
| 0.7527777777777778 | 47.511 |
| 0.7534722222222222 | 47.511 |
| 0.7541666666666668 | 47.511 |
| 0.7548611111111111 | 47.511 |
| 0.7555555555555555 | 47.511 |
| 0.75625 | 47.511 |
| 0.7569444444444445 | 47.511 |
| 0.7576388888888889 | 47.511 |
| 0.7583333333333333 | 47.511 |
| 0.7590277777777777 | 43.079 |
| 0.7597222222222223 | 43.079 |
| 0.7604166666666666 | 38.653 |
| 0.7611111111111111 | 38.653 |
| 0.7618055555555556 | 38.653 |
| 0.7625000000000001 | 38.653 |
| 0.7631944444444444 | 38.653 |
| 0.7638888888888888 | 38.653 |
| 0.7645833333333334 | 34.234 |
| 0.7652777777777778 | 34.234 |
| 0.7659722222222222 | 29.823 |
| 0.7666666666666666 | 29.823 |
| 0.7673611111111112 | 29.823 |
| 0.7680555555555556 | 34.234 |
| 0.7687499999999999 | 29.823 |
| 0.7694444444444444 | 29.823 |
| 0.7701388888888889 | 25.419 |
| 0.7708333333333334 | 25.419 |
| 0.7715277777777777 | 25.419 |
| 0.7722222222222223 | 25.419 |
| 0.7729166666666667 | 25.419 |
| 0.7736111111111111 | 25.419 |
| 0.7743055555555555 | 25.419 |
| 0.775 | 25.419 |
| 0.7756944444444445 | 25.419 |
| 0.7763888888888889 | 29.823 |
| 0.7770833333333332 | 29.823 |
| 0.7777777777777778 | 29.823 |
| 0.7784722222222222 | 29.823 |
| 0.7791666666666667 | 34.234 |
| 0.779861111111111 | 38.653 |
| 0.7805555555555556 | 38.653 |
| 0.78125 | 43.079 |
| 0.7819444444444444 | 47.511 |
| 0.782638888888889 | 51.951 |
| 0.7833333333333333 | 56.398 |
| 0.7840277777777778 | 56.398 |
| 0.7847222222222222 | 60.85 |
| 0.7854166666666668 | 60.85 |
| 0.7861111111111111 | 60.85 |
| 0.7868055555555555 | 56.398 |
| 0.7875 | 51.951 |
| 0.7881944444444445 | 51.951 |
| 0.7888888888888889 | 47.511 |
| 0.7895833333333333 | 47.511 |
| 0.7902777777777777 | 43.079 |
| 0.7909722222222223 | 43.079 |
| 0.7916666666666666 | 38.653 |
| 0.7923611111111111 | 34.234 |
| 0.7930555555555556 | 34.234 |
| 0.7937500000000001 | 29.823 |
| 0.7944444444444444 | 29.823 |
| 0.7951388888888888 | 25.419 |
| 0.7958333333333334 | 21.024 |
| 0.7965277777777778 | 21.024 |
| 0.7972222222222222 | 21.024 |
| 0.7979166666666666 | 16.636 |
| 0.7986111111111112 | 16.636 |
| 0.7993055555555556 | 12.257 |
| 0.7999999999999999 | 12.257 |
| 0.8006944444444444 | 12.257 |
| 0.8013888888888889 | 7.887 |
| 0.8020833333333334 | 7.887 |
| 0.8027777777777777 | 7.887 |
| 0.8034722222222223 | 7.887 |
| 0.8041666666666667 | 3.525 |
| 0.8048611111111111 | 3.525 |
| 0.8055555555555555 | 3.525 |
| 0.80625 | 3.525 |
| 0.8069444444444445 | 3.525 |
| 0.8076388888888889 | 3.525 |
| 0.8083333333333332 | 3.525 |
| 0.8090277777777778 | 3.525 |
| 0.8097222222222222 | 0 |
| 0.8104166666666667 | 0 |
| 0.811111111111111 | 0 |
| 0.8118055555555556 | 0 |
| 0.8125 | 0 |
| 0.8131944444444444 | 0 |
| 0.813888888888889 | 0 |
| 0.8145833333333333 | 0 |
| 0.8152777777777778 | 0 |
| 0.8159722222222222 | 0 |
| 0.8166666666666668 | 0 |
| 0.8173611111111111 | 0 |
| 0.8180555555555555 | 0 |
| 0.81875 | 0 |
| 0.8194444444444445 | 0 |
| 0.8201388888888889 | 0 |
| 0.8208333333333333 | 0 |
| 0.8215277777777777 | 0 |
| 0.8222222222222223 | 0 |
| 0.8229166666666666 | 0 |
| 0.8236111111111111 | 0 |
| 0.8243055555555556 | 0 |
| 0.8250000000000001 | 0 |
| 0.8256944444444444 | 0 |
| 0.8263888888888888 | 0 |
| 0.8270833333333334 | 0 |
| 0.8277777777777778 | 0 |
| 0.8284722222222222 | 0 |
| 0.8291666666666666 | 0 |
| 0.8298611111111112 | 0 |
| 0.8305555555555556 | 0 |
| 0.8312499999999999 | 0 |
| 0.8319444444444444 | 0 |
| 0.8326388888888889 | 0 |
| 0.8333333333333334 | 0 |
| 0.8340277777777777 | 0 |
| 0.8347222222222223 | 0 |
| 0.8354166666666667 | 0 |
| 0.8361111111111111 | 0 |
| 0.8368055555555555 | 0 |
| 0.8375 | 0 |
| 0.8381944444444445 | 0 |
| 0.8388888888888889 | 0 |
| 0.8395833333333332 | 0 |
| 0.8402777777777778 | 0 |
| 0.8409722222222222 | 0 |
| 0.8416666666666667 | 0 |
| 0.842361111111111 | 0 |
| 0.8430555555555556 | 0 |
| 0.84375 | 0 |
| 0.8444444444444444 | 0 |
| 0.845138888888889 | 0 |
| 0.8458333333333333 | 0 |
| 0.8465277777777778 | 0 |
| 0.8472222222222222 | 0 |
| 0.8479166666666668 | 0 |
| 0.8486111111111111 | 0 |
| 0.8493055555555555 | 0 |
| 0.85 | 0 |
| 0.8506944444444445 | 0 |
| 0.8513888888888889 | 0 |
| 0.8520833333333333 | 0 |
| 0.8527777777777777 | 0 |
| 0.8534722222222223 | 0 |
| 0.8541666666666666 | 0 |
| 0.8548611111111111 | 0 |
| 0.8555555555555556 | 0 |
| 0.8562500000000001 | 0 |
| 0.8569444444444444 | 0 |
| 0.8576388888888888 | 0 |
| 0.8583333333333334 | 0 |
| 0.8590277777777778 | 0 |
| 0.8597222222222222 | 0 |
| 0.8604166666666666 | 0 |
| 0.8611111111111112 | 0 |
| 0.8618055555555556 | 0 |
| 0.8624999999999999 | 0 |
| 0.8631944444444444 | 0 |
| 0.8638888888888889 | 0 |
| 0.8645833333333334 | 0 |
| 0.8652777777777777 | 0 |
| 0.8659722222222223 | 0 |
| 0.8666666666666667 | 0 |
| 0.8673611111111111 | 0 |
| 0.8680555555555555 | 0 |
| 0.86875 | 0 |
| 0.8694444444444445 | 0 |
| 0.8701388888888889 | 0 |
| 0.8708333333333332 | 0 |
| 0.8715277777777778 | 0 |
| 0.8722222222222222 | 0 |
| 0.8729166666666667 | 0 |
| 0.873611111111111 | 0 |
| 0.8743055555555556 | 0 |
| 0.875 | 0 |
| 0.8756944444444444 | 0 |
| 0.876388888888889 | 0 |
| 0.8770833333333333 | 0 |
| 0.8777777777777778 | 0 |
| 0.8784722222222222 | 0 |
| 0.8791666666666668 | 0 |
| 0.8798611111111111 | 0 |
| 0.8805555555555555 | 0 |
| 0.88125 | 0 |
| 0.8819444444444445 | 0 |
| 0.8826388888888889 | 0 |
| 0.8833333333333333 | 0 |
| 0.8840277777777777 | 0 |
| 0.8847222222222223 | 0 |
| 0.8854166666666666 | 0 |
| 0.8861111111111111 | 0 |
| 0.8868055555555556 | 0 |
| 0.8875000000000001 | 0 |
| 0.8881944444444444 | 0 |
| 0.8888888888888888 | 0 |
| 0.8895833333333334 | 0 |
| 0.8902777777777778 | 0 |
| 0.8909722222222222 | 0 |
| 0.8916666666666666 | 0 |
| 0.8923611111111112 | 0 |
| 0.8930555555555556 | 0 |
| 0.8937499999999999 | 0 |
| 0.8944444444444444 | 0 |
| 0.8951388888888889 | 0 |
| 0.8958333333333334 | 0 |
| 0.8965277777777777 | 0 |
| 0.8972222222222223 | 0 |
| 0.8979166666666667 | 0 |
| 0.8986111111111111 | 0 |
| 0.8993055555555555 | 0 |
| 0.9 | 0 |
| 0.9006944444444445 | 0 |
| 0.9013888888888889 | 0 |
| 0.9020833333333332 | 0 |
| 0.9027777777777778 | 0 |
| 0.9034722222222222 | 0 |
| 0.9041666666666667 | 0 |
| 0.904861111111111 | 0 |
| 0.9055555555555556 | 0 |
| 0.90625 | 0 |
| 0.9069444444444444 | 0 |
| 0.907638888888889 | 0 |
| 0.9083333333333333 | 0 |
| 0.9090277777777778 | 0 |
| 0.9097222222222222 | 0 |
| 0.9104166666666668 | 0 |
| 0.9111111111111111 | 0 |
| 0.9118055555555555 | 0 |
| 0.9125 | 0 |
| 0.9131944444444445 | 0 |
| 0.9138888888888889 | 0 |
| 0.9145833333333333 | 0 |
| 0.9152777777777777 | 0 |
| 0.9159722222222223 | 0 |
| 0.9166666666666666 | 0 |
| 0.9173611111111111 | 0 |
| 0.9180555555555556 | 0 |
| 0.9187500000000001 | 0 |
| 0.9194444444444444 | 0 |
| 0.9201388888888888 | 0 |
| 0.9208333333333334 | 0 |
| 0.9215277777777778 | 0 |
| 0.9222222222222222 | 0 |
| 0.9229166666666666 | 0 |
| 0.9236111111111112 | 0 |
| 0.9243055555555556 | 0 |
| 0.9249999999999999 | 0 |
| 0.9256944444444444 | 0 |
| 0.9263888888888889 | 0 |
| 0.9270833333333334 | 0 |
| 0.9277777777777777 | 0 |
| 0.9284722222222223 | 0 |
| 0.9291666666666667 | 0 |
| 0.9298611111111111 | 0 |
| 0.9305555555555555 | 0 |
| 0.93125 | 0 |
| 0.9319444444444445 | 0 |
| 0.9326388888888889 | 0 |
| 0.9333333333333332 | 0 |
| 0.9340277777777778 | 0 |
| 0.9347222222222222 | 0 |
| 0.9354166666666667 | 0 |
| 0.936111111111111 | 0 |
| 0.9368055555555556 | 0 |
| 0.9375 | 0 |
| 0.9381944444444444 | 0 |
| 0.938888888888889 | 0 |
| 0.9395833333333333 | 0 |
| 0.9402777777777778 | 0 |
| 0.9409722222222222 | 0 |
| 0.9416666666666668 | 0 |
| 0.9423611111111111 | 0 |
| 0.9430555555555555 | 0 |
| 0.94375 | 0 |
| 0.9444444444444445 | 0 |
| 0.9451388888888889 | 0 |
| 0.9458333333333333 | 0 |
| 0.9465277777777777 | 0 |
| 0.9472222222222223 | 0 |
| 0.9479166666666666 | 0 |
| 0.9486111111111111 | 0 |
| 0.9493055555555556 | 0 |
| 0.9500000000000001 | 0 |
| 0.9506944444444444 | 0 |
| 0.9513888888888888 | 0 |
| 0.9520833333333334 | 0 |
| 0.9527777777777778 | 0 |
| 0.9534722222222222 | 0 |
| 0.9541666666666666 | 0 |
| 0.9548611111111112 | 0 |
| 0.9555555555555556 | 0 |
| 0.9562499999999999 | 0 |
| 0.9569444444444444 | 0 |
| 0.9576388888888889 | 0 |
| 0.9583333333333334 | 0 |
| 0.9590277777777777 | 0 |
| 0.9597222222222223 | 0 |
| 0.9604166666666667 | 0 |
| 0.9611111111111111 | 0 |
| 0.9618055555555555 | 0 |
| 0.9625 | 0 |
| 0.9631944444444445 | 0 |
| 0.9638888888888889 | 0 |
| 0.9645833333333332 | 0 |
| 0.9652777777777778 | 0 |
| 0.9659722222222222 | 0 |
| 0.9666666666666667 | 0 |
| 0.967361111111111 | 0 |
| 0.9680555555555556 | 0 |
| 0.96875 | 0 |
| 0.9694444444444444 | 0 |
| 0.970138888888889 | 0 |
| 0.9708333333333333 | 0 |
| 0.9715277777777778 | 0 |
| 0.9722222222222222 | 0 |
| 0.9729166666666668 | 0 |
| 0.9736111111111111 | 0 |
| 0.9743055555555555 | 0 |
| 0.975 | 0 |
| 0.9756944444444445 | 0 |
| 0.9763888888888889 | 0 |
| 0.9770833333333333 | 0 |
| 0.9777777777777777 | 0 |
| 0.9784722222222223 | 0 |
| 0.9791666666666666 | 0 |
| 0.9798611111111111 | 0 |
| 0.9805555555555556 | 0 |
| 0.9812500000000001 | 0 |
| 0.9819444444444444 | 0 |
| 0.9826388888888888 | 0 |
| 0.9833333333333334 | 0 |
| 0.9840277777777778 | 0 |
| 0.9847222222222222 | 0 |
| 0.9854166666666666 | 0 |
| 0.9861111111111112 | 0 |
| 0.9868055555555556 | 0 |
| 0.9874999999999999 | 0 |
| 0.9881944444444444 | 0 |
| 0.9888888888888889 | 0 |
| 0.9895833333333334 | 0 |
| 0.9902777777777777 | 0 |
| 0.9909722222222223 | 0 |
| 0.9916666666666667 | 0 |
| 0.9923611111111111 | 0 |
| 0.9930555555555555 | 0 |
| 0.99375 | 0 |
| 0.9944444444444445 | 0 |
| 0.9951388888888889 | 0 |
| 0.9958333333333332 | 0 |
| 0.9965277777777778 | 0 |
| 0.9972222222222222 | 0 |
| 0.9979166666666667 | 0 |
| 0.998611111111111 | 0 |
| 0.9993055555555556 | 0 |